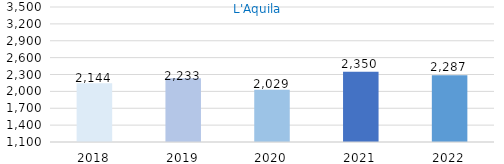
| Category | Series 0 |
|---|---|
| 2018.0 | 2144 |
| 2019.0 | 2233 |
| 2020.0 | 2029 |
| 2021.0 | 2350 |
| 2022.0 | 2287 |